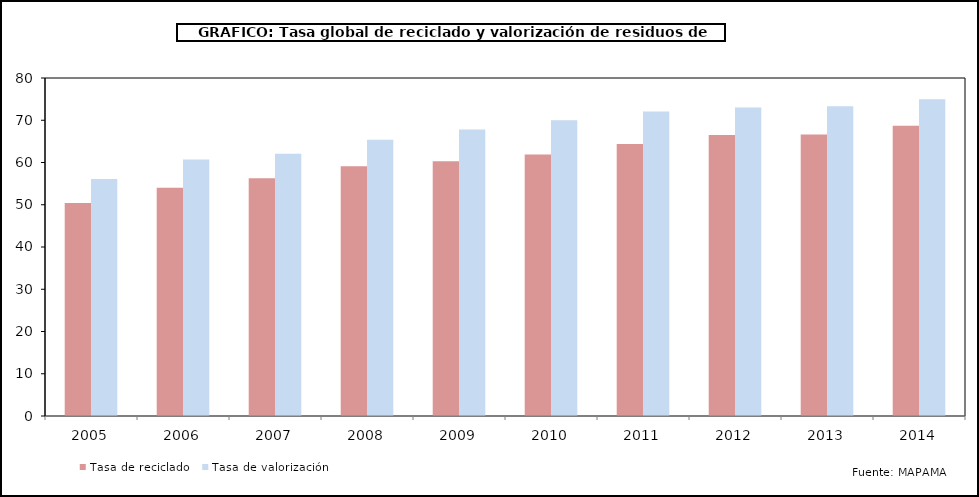
| Category | Tasa de reciclado | Tasa de valorización |
|---|---|---|
| 2005.0 | 50.4 | 56.1 |
| 2006.0 | 54 | 60.7 |
| 2007.0 | 56.3 | 62.1 |
| 2008.0 | 59.1 | 65.4 |
| 2009.0 | 60.3 | 67.8 |
| 2010.0 | 61.9 | 70 |
| 2011.0 | 64.4 | 72.1 |
| 2012.0 | 66.5 | 73 |
| 2013.0 | 66.6 | 73.3 |
| 2014.0 | 68.7 | 75 |